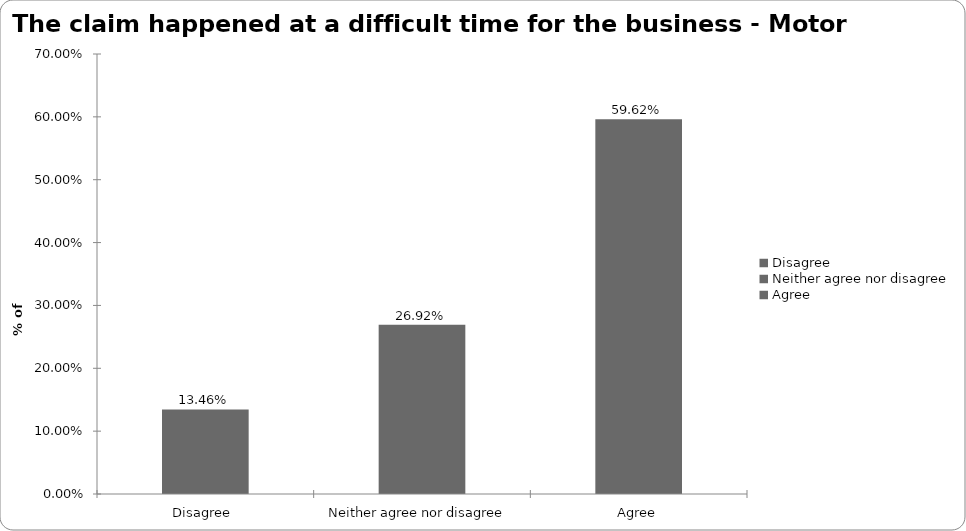
| Category | Motor |
|---|---|
| Disagree  | 0.135 |
| Neither agree nor disagree  | 0.269 |
| Agree | 0.596 |